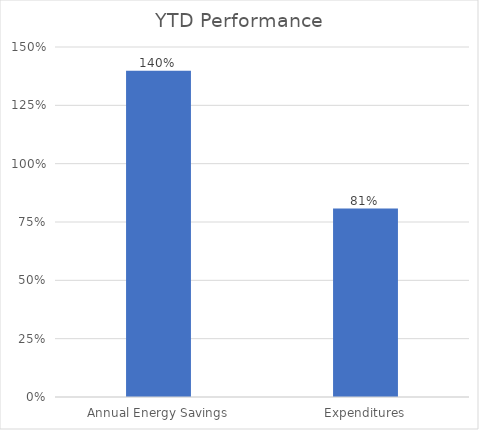
| Category | Series 0 |
|---|---|
| Annual Energy Savings | 1.398 |
| Expenditures | 0.807 |